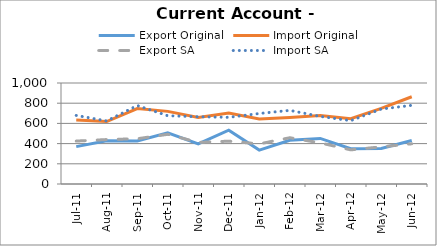
| Category | Export Original | Import Original | Export SA | Import SA |
|---|---|---|---|---|
| 2011-07-11 | 370 | 634 | 425 | 679 |
| 2011-08-11 | 429 | 618 | 440 | 624 |
| 2011-09-11 | 426 | 747 | 448 | 777 |
| 2011-10-11 | 506 | 719 | 492 | 676 |
| 2011-11-11 | 398 | 658 | 412 | 666 |
| 2011-12-11 | 533 | 703 | 424 | 660 |
| 2012-01-11 | 336 | 644 | 397 | 698 |
| 2012-02-11 | 433 | 658 | 458 | 729 |
| 2012-03-11 | 451 | 678 | 407 | 669 |
| 2012-04-11 | 350 | 647 | 338 | 627 |
| 2012-05-11 | 351 | 749 | 368 | 742 |
| 2012-06-11 | 431 | 864 | 398 | 779 |